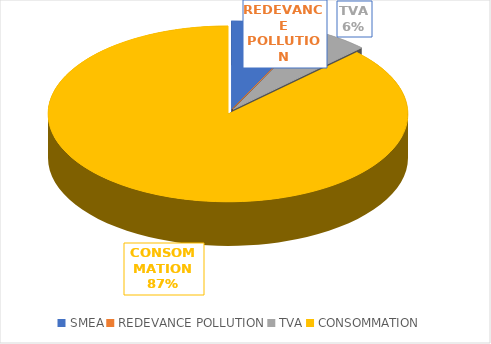
| Category | Series 0 |
|---|---|
| SMEA | 26 |
| REDEVANCE POLLUTION | 0 |
| TVA | 20.02 |
| CONSOMMATION | 317.98 |